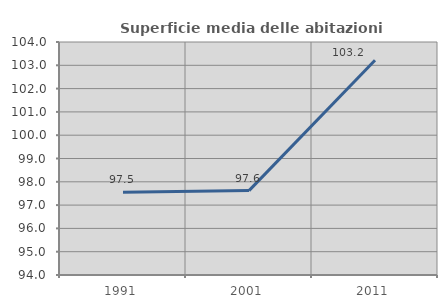
| Category | Superficie media delle abitazioni occupate |
|---|---|
| 1991.0 | 97.548 |
| 2001.0 | 97.622 |
| 2011.0 | 103.219 |